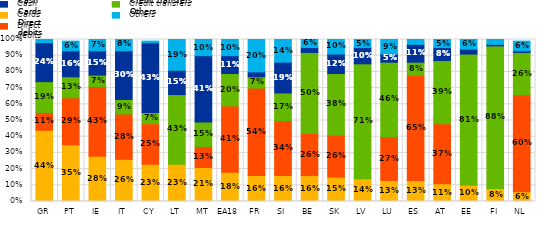
| Category | Cards | Direct debits | Credit transfers | Cash | Others |
|---|---|---|---|---|---|
| GR | 0.44 | 0.11 | 0.19 | 0.24 | 0.02 |
| PT | 0.35 | 0.29 | 0.13 | 0.16 | 0.06 |
| IE | 0.28 | 0.43 | 0.07 | 0.15 | 0.07 |
| IT | 0.26 | 0.28 | 0.09 | 0.3 | 0.08 |
| CY | 0.23 | 0.25 | 0.07 | 0.43 | 0.01 |
| LT | 0.23 | 0 | 0.43 | 0.15 | 0.19 |
| MT | 0.21 | 0.13 | 0.15 | 0.41 | 0.1 |
| EA18 | 0.18 | 0.41 | 0.2 | 0.11 | 0.1 |
| FR | 0.16 | 0.54 | 0.07 | 0.03 | 0.2 |
| SI | 0.16 | 0.34 | 0.17 | 0.19 | 0.14 |
| BE | 0.16 | 0.26 | 0.5 | 0.03 | 0.06 |
| SK | 0.15 | 0.26 | 0.38 | 0.12 | 0.1 |
| LV | 0.14 | 0 | 0.71 | 0.1 | 0.05 |
| LU | 0.13 | 0.27 | 0.46 | 0.05 | 0.09 |
| ES | 0.13 | 0.65 | 0.08 | 0.11 | 0.03 |
| AT | 0.11 | 0.37 | 0.39 | 0.08 | 0.05 |
| EE | 0.1 | 0 | 0.81 | 0.03 | 0.06 |
| FI | 0.08 | 0 | 0.88 | 0.01 | 0.03 |
| NL | 0.06 | 0.6 | 0.26 | 0.01 | 0.06 |